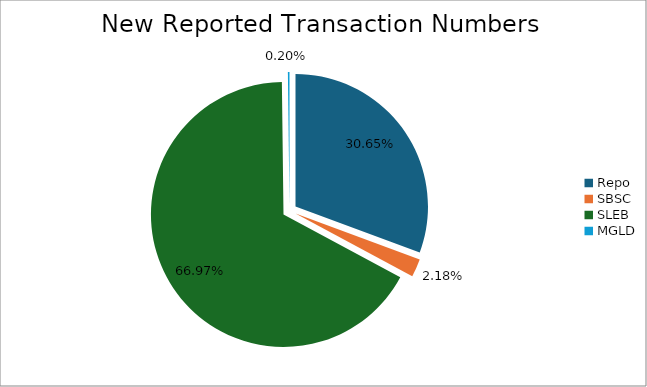
| Category | Series 0 |
|---|---|
| Repo | 465466 |
| SBSC | 33168 |
| SLEB | 1016950 |
| MGLD | 2969 |